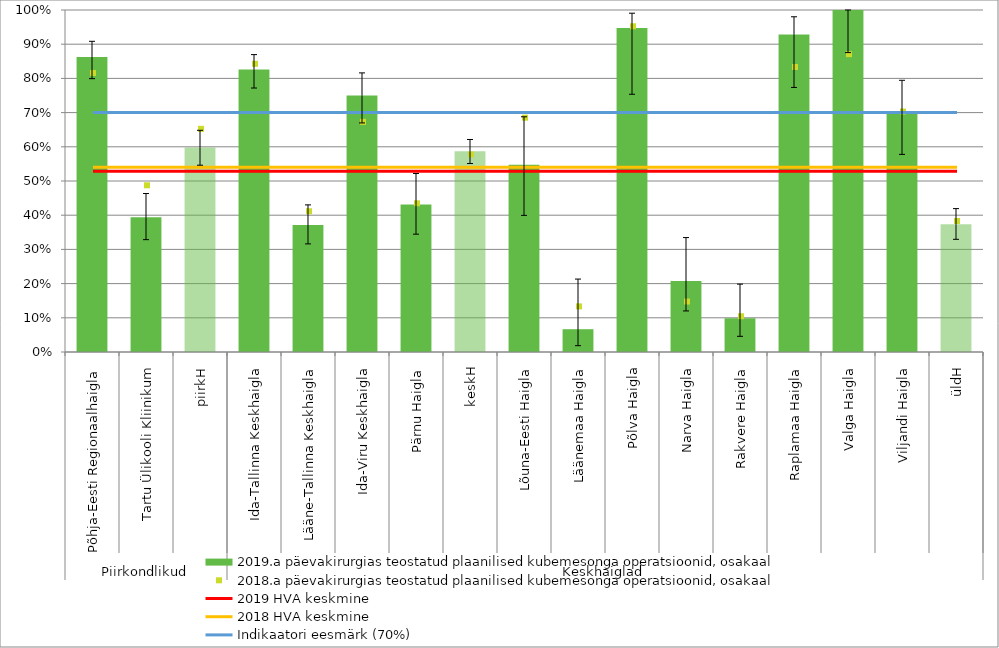
| Category | 2019.a päevakirurgias teostatud plaanilised kubemesonga operatsioonid, osakaal |
|---|---|
| 0 | 0.863 |
| 1 | 0.394 |
| 2 | 0.598 |
| 3 | 0.826 |
| 4 | 0.371 |
| 5 | 0.75 |
| 6 | 0.431 |
| 7 | 0.587 |
| 8 | 0.548 |
| 9 | 0.067 |
| 10 | 0.947 |
| 11 | 0.208 |
| 12 | 0.098 |
| 13 | 0.929 |
| 14 | 1 |
| 15 | 0.697 |
| 16 | 0.373 |